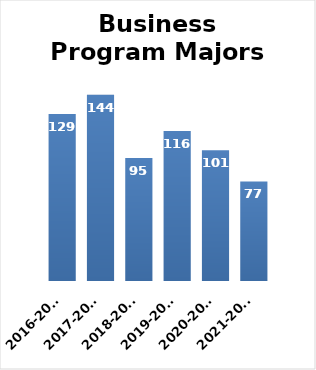
| Category | Series 0 |
|---|---|
| 2016-2017 | 129 |
| 2017-2018 | 144 |
| 2018-2019 | 95 |
| 2019-2020 | 116 |
| 2020-2021 | 101 |
| 2021-2022 | 77 |